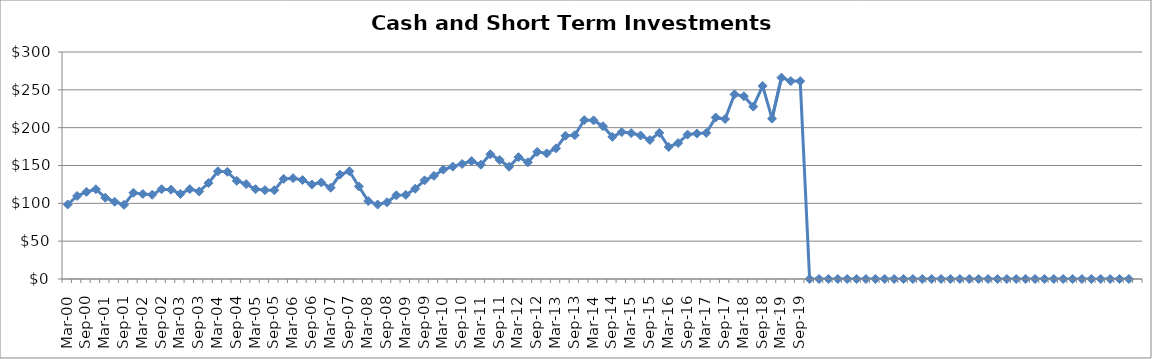
| Category | Cash and Short-Term Investments ($Millions) |
|---|---|
| Mar-00 | 98.467 |
| Jun-00 | 109.757 |
| Sep-00 | 115.162 |
| Dec-00 | 118.628 |
| Mar-01 | 107.4 |
| Jun-01 | 102.108 |
| Sep-01 | 97.998 |
| Dec-01 | 113.932 |
| Mar-02 | 112.337 |
| Jun-02 | 111.343 |
| Sep-02 | 118.726 |
| Dec-02 | 118.023 |
| Mar-03 | 112.428 |
| Jun-03 | 118.772 |
| Sep-03 | 115.683 |
| Dec-03 | 126.839 |
| Mar-04 | 142.387 |
| Jun-04 | 141.613 |
| Sep-04 | 129.811 |
| Dec-04 | 125.388 |
| Mar-05 | 118.686 |
| Jun-05 | 117.489 |
| Sep-05 | 117.249 |
| Dec-05 | 132.268 |
| Mar-06 | 133.266 |
| Jun-06 | 130.809 |
| Sep-06 | 124.858 |
| Dec-06 | 127.595 |
| Mar-07 | 120.675 |
| Jun-07 | 137.971 |
| Sep-07 | 142.382 |
| Dec-07 | 122.343 |
| Mar-08 | 103.028 |
| Jun-08 | 98.41 |
| Sep-08 | 101.401 |
| Dec-08 | 110.558 |
| Mar-09 | 111.156 |
| Jun-09 | 119.232 |
| Sep-09 | 130.388 |
| Dec-09 | 136.289 |
| Mar-10 | 144.576 |
| Jun-10 | 148.496 |
| Sep-10 | 152.072 |
| Dec-10 | 155.782 |
| Mar-11 | 151.038 |
| Jun-11 | 164.817 |
| Sep-11 | 157.316 |
| Dec-11 | 148.3 |
| Mar-12 | 161.016 |
| Jun-12 | 154.183 |
| Sep-12 | 168.002 |
| Dec-12 | 166.028 |
| Mar-13 | 172.703 |
| Jun-13 | 189.294 |
| Sep-13 | 190.083 |
| Dec-13 | 210.013 |
| Mar-14 | 209.637 |
| Jun-14 | 201.879 |
| Sep-14 | 187.883 |
| Dec-14 | 194.202 |
| Mar-15 | 192.831 |
| Jun-15 | 189.65 |
| Sep-15 | 183.666 |
| Dec-15 | 193.12 |
| Mar-16 | 174.457 |
| Jun-16 | 179.646 |
| Sep-16 | 190.873 |
| Dec-16 | 192.227 |
| Mar-17 | 193.072 |
| Jun-17 | 213.471 |
| Sep-17 | 211.341 |
| Dec-17 | 243.994 |
| Mar-18 | 241.62 |
| Jun-18 | 227.812 |
| Sep-18 | 255.172 |
| Dec-18 | 211.859 |
| Mar-19 | 266.128 |
| Jun-19 | 261.517 |
| Sep-19 | 261.51 |